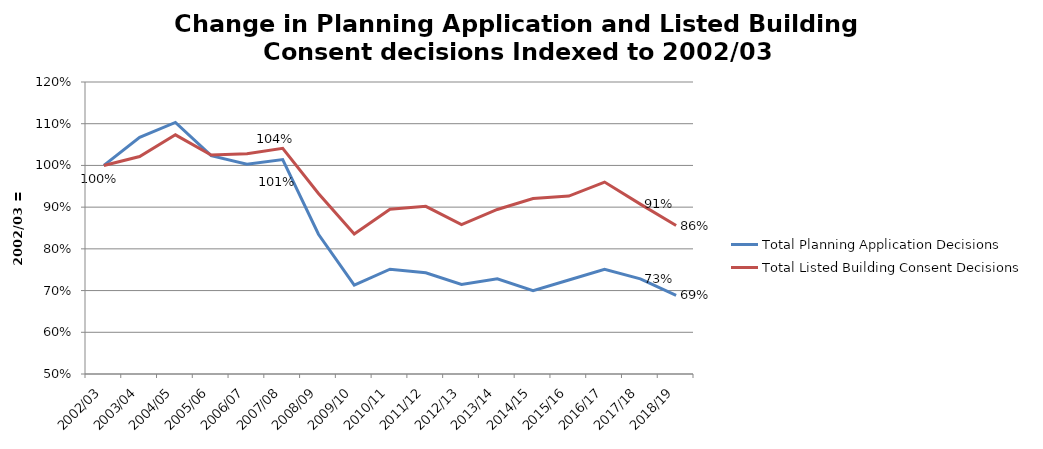
| Category | Total Planning Application Decisions | Total Listed Building Consent Decisions |
|---|---|---|
| 2002/03 | 1 | 1 |
| 2003/04 | 1.067 | 1.021 |
| 2004/05 | 1.103 | 1.073 |
| 2005/06 | 1.024 | 1.025 |
| 2006/07 | 1.003 | 1.028 |
| 2007/08 | 1.014 | 1.041 |
| 2008/09 | 0.835 | 0.933 |
| 2009/10 | 0.713 | 0.836 |
| 2010/11 | 0.751 | 0.895 |
| 2011/12 | 0.743 | 0.902 |
| 2012/13 | 0.715 | 0.858 |
| 2013/14 | 0.728 | 0.894 |
| 2014/15 | 0.7 | 0.921 |
| 2015/16 | 0.725 | 0.927 |
| 2016/17 | 0.751 | 0.96 |
| 2017/18 | 0.728 | 0.907 |
| 2018/19 | 0.689 | 0.856 |